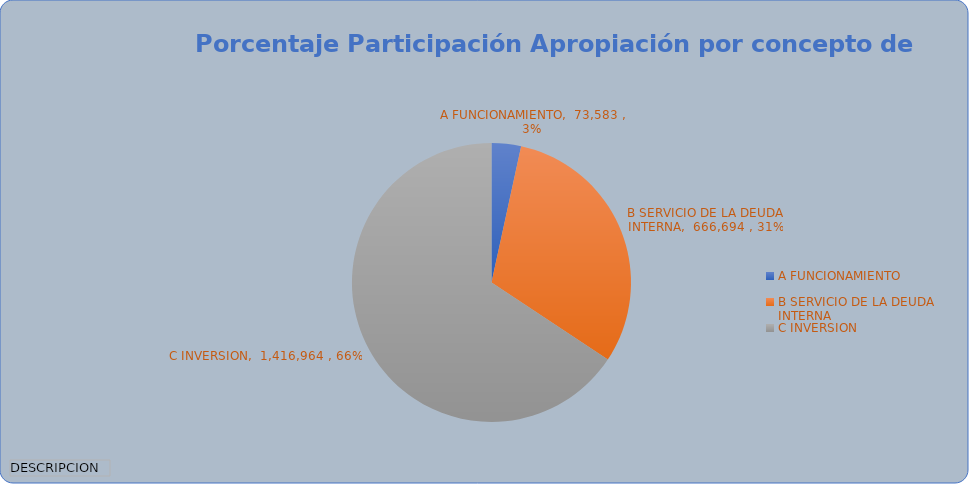
| Category | Total |
|---|---|
| A FUNCIONAMIENTO | 73583.024 |
| B SERVICIO DE LA DEUDA INTERNA | 666693.529 |
| C INVERSION | 1416964.092 |